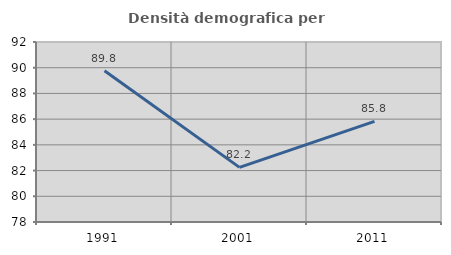
| Category | Densità demografica |
|---|---|
| 1991.0 | 89.757 |
| 2001.0 | 82.247 |
| 2011.0 | 85.823 |